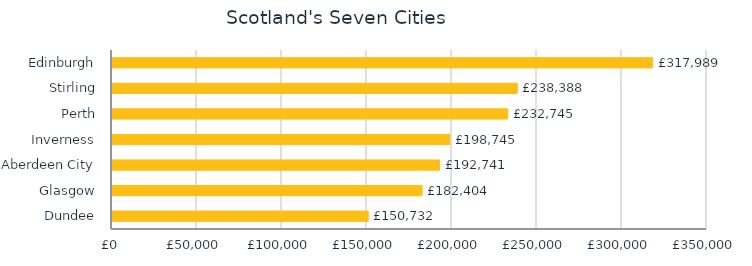
| Category | Series 0 |
|---|---|
| Dundee | 150732.489 |
| Glasgow | 182403.541 |
| Aberdeen City | 192741.037 |
| Inverness | 198744.881 |
| Perth | 232744.797 |
| Stirling | 238388.27 |
| Edinburgh | 317989.061 |